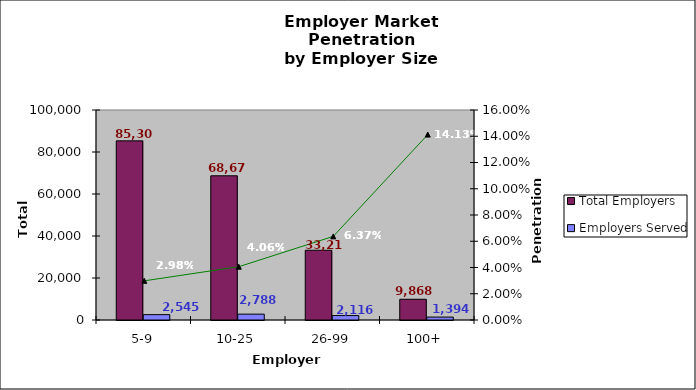
| Category | Total Employers | Employers Served |
|---|---|---|
| 5-9 | 85306 | 2545 |
| 10-25 | 68673 | 2788 |
| 26-99 | 33212 | 2116 |
| 100+ | 9868 | 1394 |